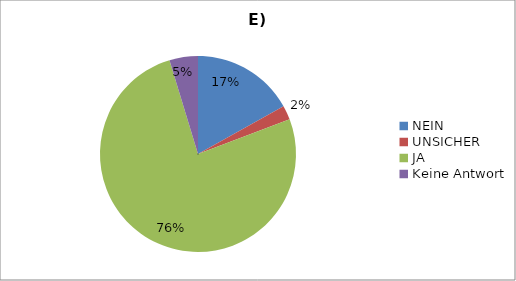
| Category | Series 0 |
|---|---|
| NEIN | 79 |
| UNSICHER | 11 |
| JA | 356 |
| Keine Antwort | 22 |